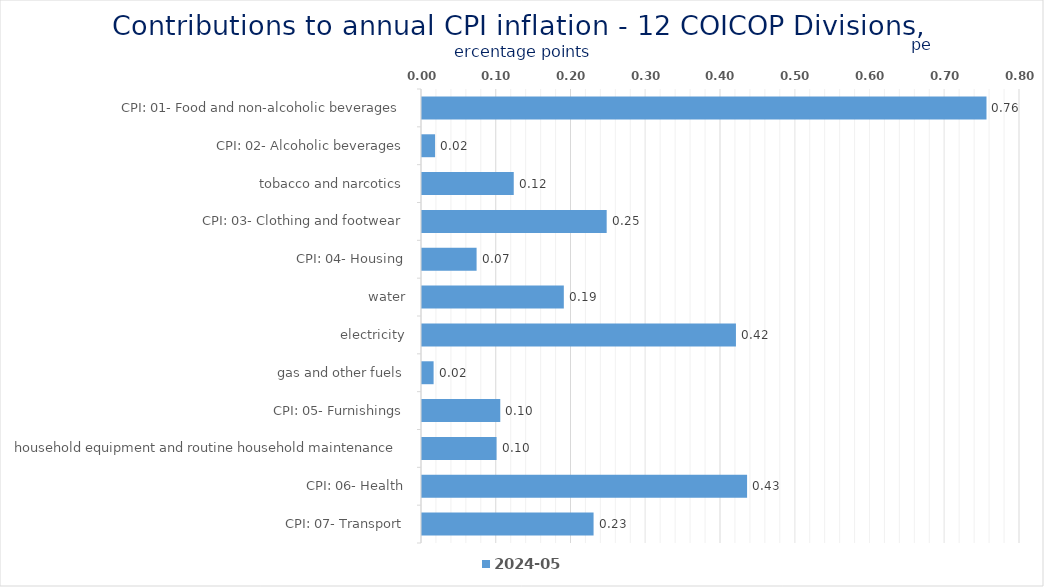
| Category | 2024-05 |
|---|---|
| CPI: 01- Food and non-alcoholic beverages | 0.755 |
| CPI: 02- Alcoholic beverages, tobacco and narcotics | 0.017 |
| CPI: 03- Clothing and footwear | 0.123 |
| CPI: 04- Housing, water, electricity, gas and other fuels | 0.247 |
| CPI: 05- Furnishings, household equipment and routine household maintenance | 0.073 |
| CPI: 06- Health | 0.19 |
| CPI: 07- Transport | 0.42 |
| CPI: 08- Communication | 0.016 |
| CPI: 09- Recreation and culture | 0.105 |
| CPI: 10- Education | 0.1 |
| CPI: 11- Restaurants and hotels | 0.435 |
| CPI: 12- Miscellaneous goods and services | 0.23 |